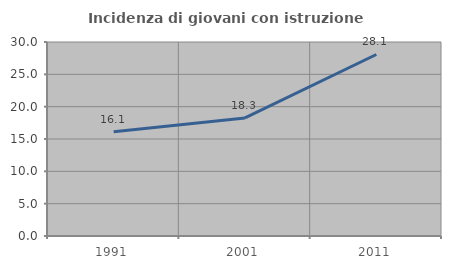
| Category | Incidenza di giovani con istruzione universitaria |
|---|---|
| 1991.0 | 16.129 |
| 2001.0 | 18.261 |
| 2011.0 | 28.07 |